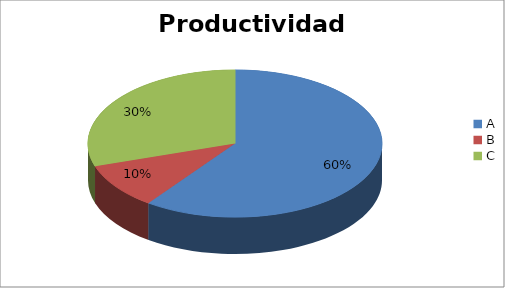
| Category | Series 0 |
|---|---|
| A | 60 |
| B | 10 |
| C | 30 |